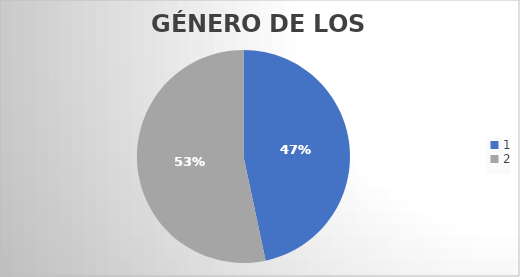
| Category | Series 0 |
|---|---|
| 0 | 7 |
| 1 | 8 |